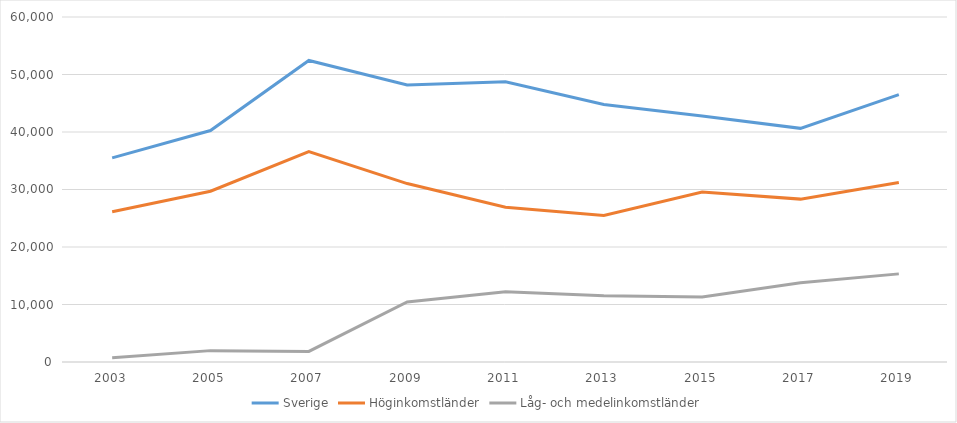
| Category | Sverige | Höginkomstländer | Låg- och medelinkomstländer |
|---|---|---|---|
| 2003.0 | 35492.815 | 26116.97 | 747.169 |
| 2005.0 | 40249.031 | 29705.35 | 1977.862 |
| 2007.0 | 52440.656 | 36584.471 | 1842.792 |
| 2009.0 | 48169.8 | 31030.4 | 10447.6 |
| 2011.0 | 48742.074 | 26912.8 | 12220.2 |
| 2013.0 | 44783.859 | 25476.6 | 11534.6 |
| 2015.0 | 42767.004 | 29557 | 11285.6 |
| 2017.0 | 40632.835 | 28327.6 | 13770 |
| 2019.0 | 46493 | 31200 | 15326 |